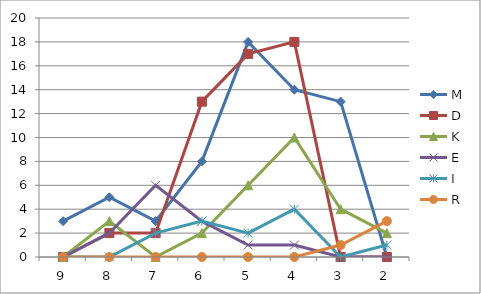
| Category | M | D | K | E | I | R |
|---|---|---|---|---|---|---|
| 9.0 | 3 | 0 | 0 | 0 | 0 | 0 |
| 8.0 | 5 | 2 | 3 | 2 | 0 | 0 |
| 7.0 | 3 | 2 | 0 | 6 | 2 | 0 |
| 6.0 | 8 | 13 | 2 | 3 | 3 | 0 |
| 5.0 | 18 | 17 | 6 | 1 | 2 | 0 |
| 4.0 | 14 | 18 | 10 | 1 | 4 | 0 |
| 3.0 | 13 | 0 | 4 | 0 | 0 | 1 |
| 2.0 | 0 | 0 | 2 | 0 | 1 | 3 |